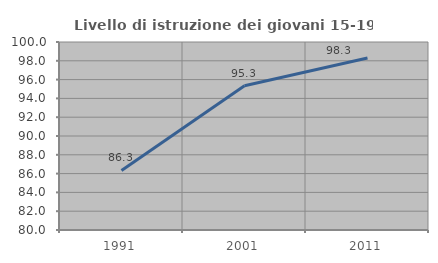
| Category | Livello di istruzione dei giovani 15-19 anni |
|---|---|
| 1991.0 | 86.338 |
| 2001.0 | 95.347 |
| 2011.0 | 98.299 |